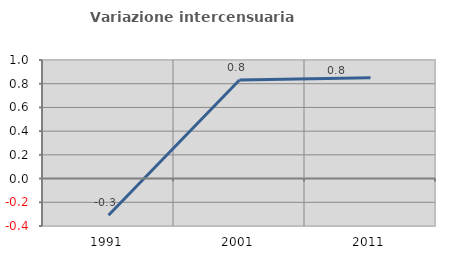
| Category | Variazione intercensuaria annua |
|---|---|
| 1991.0 | -0.31 |
| 2001.0 | 0.831 |
| 2011.0 | 0.85 |